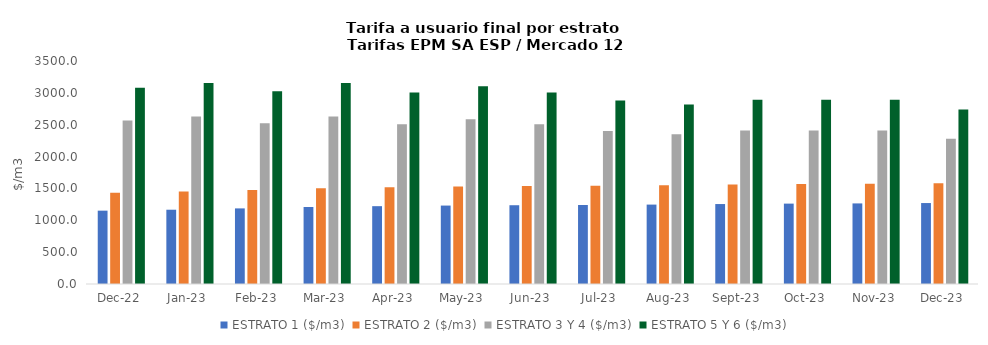
| Category | ESTRATO 1 ($/m3) | ESTRATO 2 ($/m3) | ESTRATO 3 Y 4 ($/m3) | ESTRATO 5 Y 6 ($/m3) |
|---|---|---|---|---|
| 2022-12-01 | 1151.14 | 1432.98 | 2567.54 | 3081.048 |
| 2023-01-01 | 1165.79 | 1451.1 | 2629.41 | 3155.292 |
| 2023-02-01 | 1186.59 | 1476.94 | 2522.44 | 3026.928 |
| 2023-03-01 | 1208.96 | 1503.32 | 2629.41 | 3155.292 |
| 2023-04-01 | 1221.6 | 1518.97 | 2505.94 | 3007.128 |
| 2023-05-01 | 1231.01 | 1530.94 | 2586.17 | 3103.404 |
| 2023-06-01 | 1236.39 | 1537.58 | 2505.94 | 3007.128 |
| 2023-07-01 | 1240.07 | 1542.24 | 2401.05 | 2881.26 |
| 2023-08-01 | 1246.26 | 1549.97 | 2349.35 | 2819.22 |
| 2023-09-01 | 1254.93 | 1560.74 | 2408.97 | 2890.764 |
| 2023-10-01 | 1261.68 | 1568.93 | 2408.97 | 2890.764 |
| 2023-11-01 | 1264.8 | 1572.96 | 2408.97 | 2890.764 |
| 2023-12-01 | 1270.61 | 1580.3 | 2281.06 | 2737.272 |